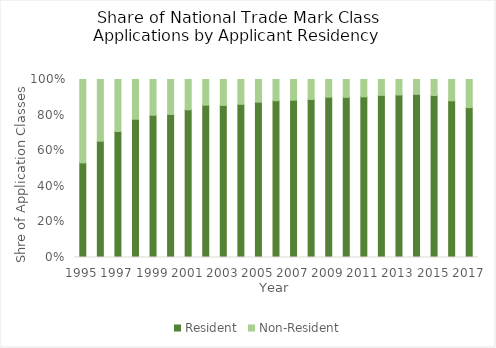
| Category | Resident | Non-Resident |
|---|---|---|
| 1995.0 | 0.532 | 0.468 |
| 1996.0 | 0.653 | 0.347 |
| 1997.0 | 0.708 | 0.292 |
| 1998.0 | 0.777 | 0.223 |
| 1999.0 | 0.799 | 0.201 |
| 2000.0 | 0.804 | 0.196 |
| 2001.0 | 0.83 | 0.17 |
| 2002.0 | 0.856 | 0.144 |
| 2003.0 | 0.854 | 0.146 |
| 2004.0 | 0.861 | 0.139 |
| 2005.0 | 0.872 | 0.128 |
| 2006.0 | 0.881 | 0.119 |
| 2007.0 | 0.884 | 0.116 |
| 2008.0 | 0.888 | 0.112 |
| 2009.0 | 0.901 | 0.099 |
| 2010.0 | 0.9 | 0.1 |
| 2011.0 | 0.903 | 0.097 |
| 2012.0 | 0.911 | 0.089 |
| 2013.0 | 0.913 | 0.087 |
| 2014.0 | 0.917 | 0.083 |
| 2015.0 | 0.91 | 0.09 |
| 2016.0 | 0.88 | 0.12 |
| 2017.0 | 0.842 | 0.158 |